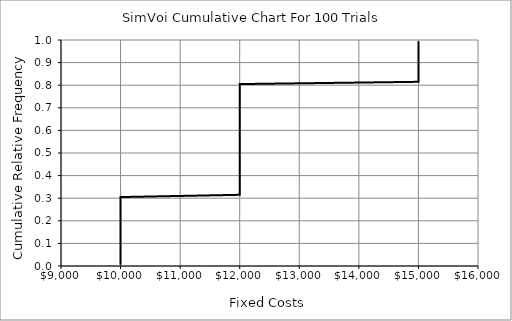
| Category | Series 0 |
|---|---|
| 10000.0 | 0.005 |
| 10000.0 | 0.015 |
| 10000.0 | 0.025 |
| 10000.0 | 0.035 |
| 10000.0 | 0.045 |
| 10000.0 | 0.055 |
| 10000.0 | 0.065 |
| 10000.0 | 0.075 |
| 10000.0 | 0.085 |
| 10000.0 | 0.095 |
| 10000.0 | 0.105 |
| 10000.0 | 0.115 |
| 10000.0 | 0.125 |
| 10000.0 | 0.135 |
| 10000.0 | 0.145 |
| 10000.0 | 0.155 |
| 10000.0 | 0.165 |
| 10000.0 | 0.175 |
| 10000.0 | 0.185 |
| 10000.0 | 0.195 |
| 10000.0 | 0.205 |
| 10000.0 | 0.215 |
| 10000.0 | 0.225 |
| 10000.0 | 0.235 |
| 10000.0 | 0.245 |
| 10000.0 | 0.255 |
| 10000.0 | 0.265 |
| 10000.0 | 0.275 |
| 10000.0 | 0.285 |
| 10000.0 | 0.295 |
| 10000.0 | 0.305 |
| 12000.0 | 0.315 |
| 12000.0 | 0.325 |
| 12000.0 | 0.335 |
| 12000.0 | 0.345 |
| 12000.0 | 0.355 |
| 12000.0 | 0.365 |
| 12000.0 | 0.375 |
| 12000.0 | 0.385 |
| 12000.0 | 0.395 |
| 12000.0 | 0.405 |
| 12000.0 | 0.415 |
| 12000.0 | 0.425 |
| 12000.0 | 0.435 |
| 12000.0 | 0.445 |
| 12000.0 | 0.455 |
| 12000.0 | 0.465 |
| 12000.0 | 0.475 |
| 12000.0 | 0.485 |
| 12000.0 | 0.495 |
| 12000.0 | 0.505 |
| 12000.0 | 0.515 |
| 12000.0 | 0.525 |
| 12000.0 | 0.535 |
| 12000.0 | 0.545 |
| 12000.0 | 0.555 |
| 12000.0 | 0.565 |
| 12000.0 | 0.575 |
| 12000.0 | 0.585 |
| 12000.0 | 0.595 |
| 12000.0 | 0.605 |
| 12000.0 | 0.615 |
| 12000.0 | 0.625 |
| 12000.0 | 0.635 |
| 12000.0 | 0.645 |
| 12000.0 | 0.655 |
| 12000.0 | 0.665 |
| 12000.0 | 0.675 |
| 12000.0 | 0.685 |
| 12000.0 | 0.695 |
| 12000.0 | 0.705 |
| 12000.0 | 0.715 |
| 12000.0 | 0.725 |
| 12000.0 | 0.735 |
| 12000.0 | 0.745 |
| 12000.0 | 0.755 |
| 12000.0 | 0.765 |
| 12000.0 | 0.775 |
| 12000.0 | 0.785 |
| 12000.0 | 0.795 |
| 12000.0 | 0.805 |
| 15000.0 | 0.815 |
| 15000.0 | 0.825 |
| 15000.0 | 0.835 |
| 15000.0 | 0.845 |
| 15000.0 | 0.855 |
| 15000.0 | 0.865 |
| 15000.0 | 0.875 |
| 15000.0 | 0.885 |
| 15000.0 | 0.895 |
| 15000.0 | 0.905 |
| 15000.0 | 0.915 |
| 15000.0 | 0.925 |
| 15000.0 | 0.935 |
| 15000.0 | 0.945 |
| 15000.0 | 0.955 |
| 15000.0 | 0.965 |
| 15000.0 | 0.975 |
| 15000.0 | 0.985 |
| 15000.0 | 0.995 |